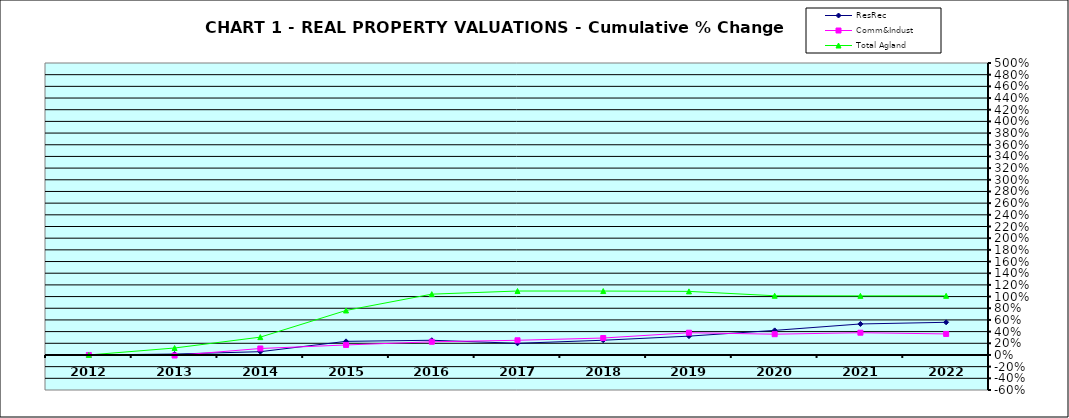
| Category | ResRec | Comm&Indust | Total Agland |
|---|---|---|---|
| 2012.0 | 0 | 0 | 0 |
| 2013.0 | 0.016 | -0.01 | 0.119 |
| 2014.0 | 0.056 | 0.111 | 0.305 |
| 2015.0 | 0.233 | 0.171 | 0.762 |
| 2016.0 | 0.252 | 0.226 | 1.041 |
| 2017.0 | 0.2 | 0.251 | 1.095 |
| 2018.0 | 0.252 | 0.29 | 1.094 |
| 2019.0 | 0.322 | 0.381 | 1.089 |
| 2020.0 | 0.421 | 0.356 | 1.014 |
| 2021.0 | 0.531 | 0.381 | 1.012 |
| 2022.0 | 0.559 | 0.36 | 1.012 |